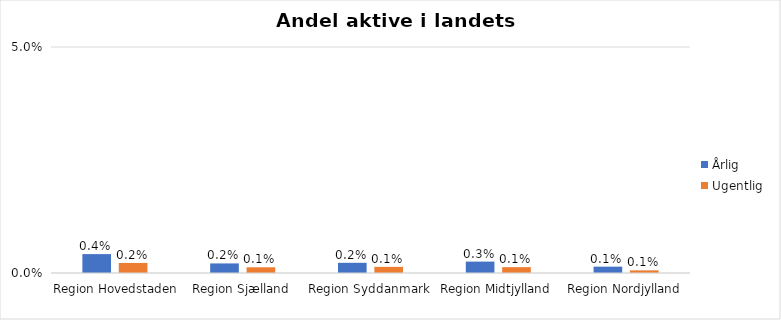
| Category | Årlig | Ugentlig |
|---|---|---|
| Region Hovedstaden | 0.004 | 0.002 |
| Region Sjælland | 0.002 | 0.001 |
| Region Syddanmark | 0.002 | 0.001 |
| Region Midtjylland | 0.003 | 0.001 |
| Region Nordjylland | 0.001 | 0.001 |